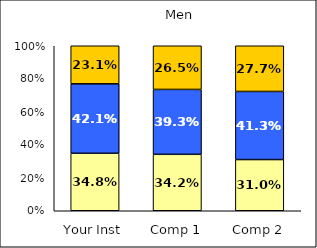
| Category | Low Habits of Mind | Average Habits of Mind | High Habits of Mind |
|---|---|---|---|
| Your Inst | 0.348 | 0.421 | 0.231 |
| Comp 1 | 0.342 | 0.393 | 0.265 |
| Comp 2 | 0.31 | 0.413 | 0.277 |